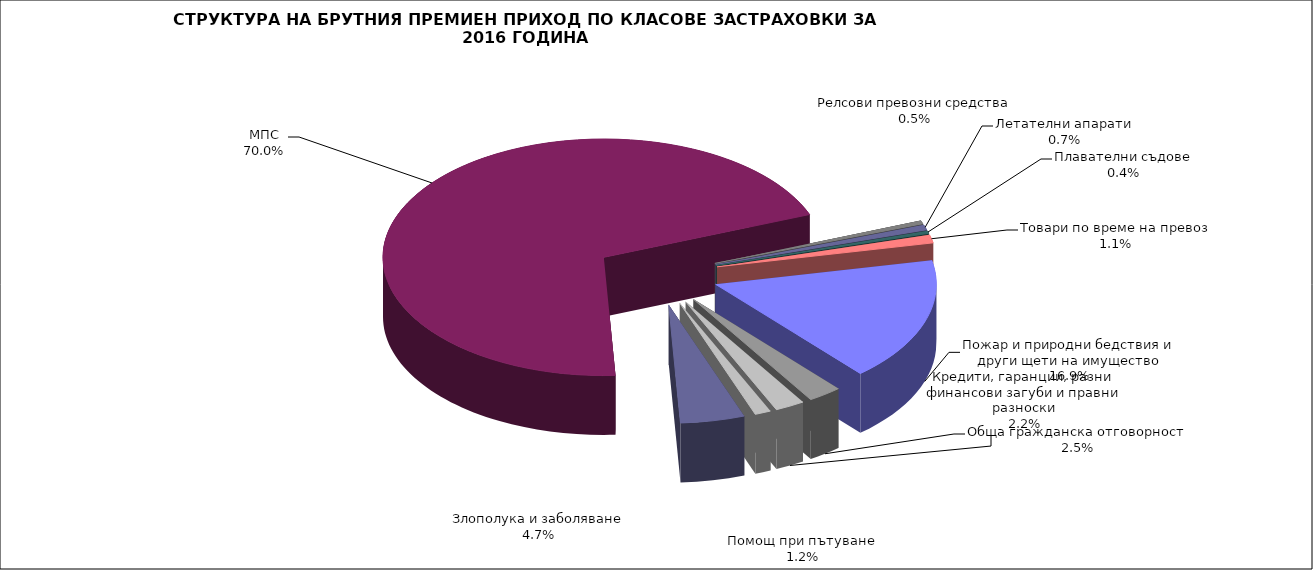
| Category | Series 0 |
|---|---|
| Злополука и заболяване | 0.047 |
| МПС | 0.7 |
| Релсови превозни средства | 0.005 |
| Летателни апарати | 0.007 |
| Плавателни съдове | 0.004 |
| Товари по време на превоз | 0.011 |
| Пожар и природни бедствия и други щети на имущество | 0.169 |
| Обща гражданска отговорност | 0.025 |
| Кредити, гаранции, разни финансови загуби и правни разноски | 0.022 |
| Помощ при пътуване | 0.012 |